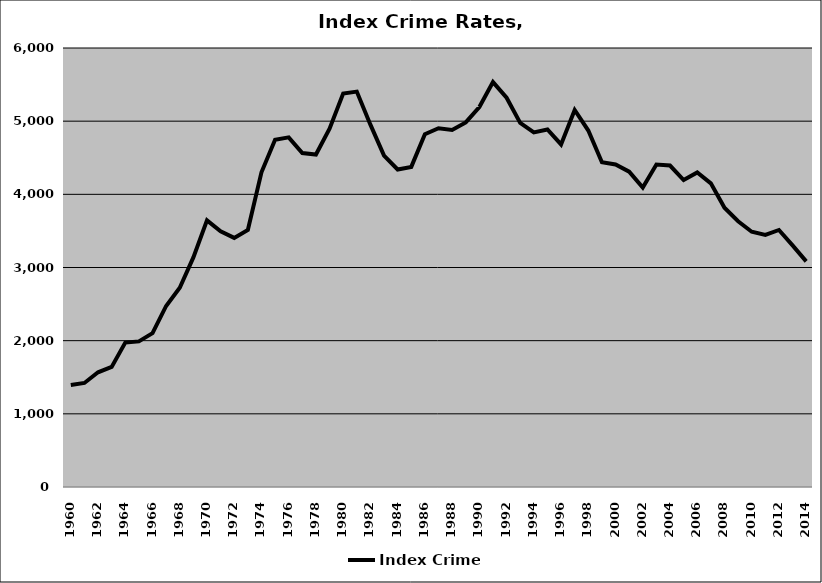
| Category | Index Crime |
|---|---|
| 1960.0 | 1395.017 |
| 1961.0 | 1422.06 |
| 1962.0 | 1567.868 |
| 1963.0 | 1642.022 |
| 1964.0 | 1973.843 |
| 1965.0 | 1990.242 |
| 1966.0 | 2102.044 |
| 1967.0 | 2474.505 |
| 1968.0 | 2723.708 |
| 1969.0 | 3138.044 |
| 1970.0 | 3643.549 |
| 1971.0 | 3495.217 |
| 1972.0 | 3404.827 |
| 1973.0 | 3513.778 |
| 1974.0 | 4300.396 |
| 1975.0 | 4746.978 |
| 1976.0 | 4778.442 |
| 1977.0 | 4563.801 |
| 1978.0 | 4544.123 |
| 1979.0 | 4895.779 |
| 1980.0 | 5378.84 |
| 1981.0 | 5404.284 |
| 1982.0 | 4951.993 |
| 1983.0 | 4529.773 |
| 1984.0 | 4339.336 |
| 1985.0 | 4375.102 |
| 1986.0 | 4822.552 |
| 1987.0 | 4903.877 |
| 1988.0 | 4879.895 |
| 1989.0 | 4982.849 |
| 1990.0 | 5193.145 |
| 1991.0 | 5534.309 |
| 1992.0 | 5319.937 |
| 1993.0 | 4975.267 |
| 1994.0 | 4846.946 |
| 1995.0 | 4886.94 |
| 1996.0 | 4681.726 |
| 1997.0 | 5152.37 |
| 1998.0 | 4872.043 |
| 1999.0 | 4438.609 |
| 2000.0 | 4408.801 |
| 2001.0 | 4309.423 |
| 2002.0 | 4093.158 |
| 2003.0 | 4407.942 |
| 2004.0 | 4393.354 |
| 2005.0 | 4195.116 |
| 2006.0 | 4299.051 |
| 2007.0 | 4150.509 |
| 2008.0 | 3816.971 |
| 2009.0 | 3632.465 |
| 2010.0 | 3489.025 |
| 2011.0 | 3444.275 |
| 2012.0 | 3512.791 |
| 2013.0 | 3302.437 |
| 2014.0 | 3083.793 |